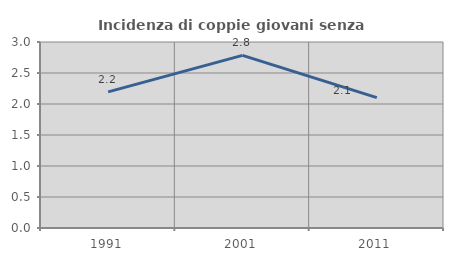
| Category | Incidenza di coppie giovani senza figli |
|---|---|
| 1991.0 | 2.195 |
| 2001.0 | 2.785 |
| 2011.0 | 2.103 |